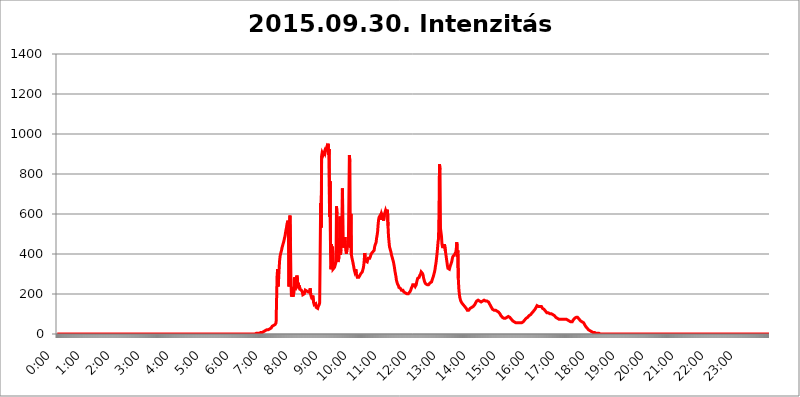
| Category | 2015.09.30. Intenzitás [W/m^2] |
|---|---|
| 0.0 | 0 |
| 0.0006944444444444445 | 0 |
| 0.001388888888888889 | 0 |
| 0.0020833333333333333 | 0 |
| 0.002777777777777778 | 0 |
| 0.003472222222222222 | 0 |
| 0.004166666666666667 | 0 |
| 0.004861111111111111 | 0 |
| 0.005555555555555556 | 0 |
| 0.0062499999999999995 | 0 |
| 0.006944444444444444 | 0 |
| 0.007638888888888889 | 0 |
| 0.008333333333333333 | 0 |
| 0.009027777777777779 | 0 |
| 0.009722222222222222 | 0 |
| 0.010416666666666666 | 0 |
| 0.011111111111111112 | 0 |
| 0.011805555555555555 | 0 |
| 0.012499999999999999 | 0 |
| 0.013194444444444444 | 0 |
| 0.013888888888888888 | 0 |
| 0.014583333333333332 | 0 |
| 0.015277777777777777 | 0 |
| 0.015972222222222224 | 0 |
| 0.016666666666666666 | 0 |
| 0.017361111111111112 | 0 |
| 0.018055555555555557 | 0 |
| 0.01875 | 0 |
| 0.019444444444444445 | 0 |
| 0.02013888888888889 | 0 |
| 0.020833333333333332 | 0 |
| 0.02152777777777778 | 0 |
| 0.022222222222222223 | 0 |
| 0.02291666666666667 | 0 |
| 0.02361111111111111 | 0 |
| 0.024305555555555556 | 0 |
| 0.024999999999999998 | 0 |
| 0.025694444444444447 | 0 |
| 0.02638888888888889 | 0 |
| 0.027083333333333334 | 0 |
| 0.027777777777777776 | 0 |
| 0.02847222222222222 | 0 |
| 0.029166666666666664 | 0 |
| 0.029861111111111113 | 0 |
| 0.030555555555555555 | 0 |
| 0.03125 | 0 |
| 0.03194444444444445 | 0 |
| 0.03263888888888889 | 0 |
| 0.03333333333333333 | 0 |
| 0.034027777777777775 | 0 |
| 0.034722222222222224 | 0 |
| 0.035416666666666666 | 0 |
| 0.036111111111111115 | 0 |
| 0.03680555555555556 | 0 |
| 0.0375 | 0 |
| 0.03819444444444444 | 0 |
| 0.03888888888888889 | 0 |
| 0.03958333333333333 | 0 |
| 0.04027777777777778 | 0 |
| 0.04097222222222222 | 0 |
| 0.041666666666666664 | 0 |
| 0.042361111111111106 | 0 |
| 0.04305555555555556 | 0 |
| 0.043750000000000004 | 0 |
| 0.044444444444444446 | 0 |
| 0.04513888888888889 | 0 |
| 0.04583333333333334 | 0 |
| 0.04652777777777778 | 0 |
| 0.04722222222222222 | 0 |
| 0.04791666666666666 | 0 |
| 0.04861111111111111 | 0 |
| 0.049305555555555554 | 0 |
| 0.049999999999999996 | 0 |
| 0.05069444444444445 | 0 |
| 0.051388888888888894 | 0 |
| 0.052083333333333336 | 0 |
| 0.05277777777777778 | 0 |
| 0.05347222222222222 | 0 |
| 0.05416666666666667 | 0 |
| 0.05486111111111111 | 0 |
| 0.05555555555555555 | 0 |
| 0.05625 | 0 |
| 0.05694444444444444 | 0 |
| 0.057638888888888885 | 0 |
| 0.05833333333333333 | 0 |
| 0.05902777777777778 | 0 |
| 0.059722222222222225 | 0 |
| 0.06041666666666667 | 0 |
| 0.061111111111111116 | 0 |
| 0.06180555555555556 | 0 |
| 0.0625 | 0 |
| 0.06319444444444444 | 0 |
| 0.06388888888888888 | 0 |
| 0.06458333333333334 | 0 |
| 0.06527777777777778 | 0 |
| 0.06597222222222222 | 0 |
| 0.06666666666666667 | 0 |
| 0.06736111111111111 | 0 |
| 0.06805555555555555 | 0 |
| 0.06874999999999999 | 0 |
| 0.06944444444444443 | 0 |
| 0.07013888888888889 | 0 |
| 0.07083333333333333 | 0 |
| 0.07152777777777779 | 0 |
| 0.07222222222222223 | 0 |
| 0.07291666666666667 | 0 |
| 0.07361111111111111 | 0 |
| 0.07430555555555556 | 0 |
| 0.075 | 0 |
| 0.07569444444444444 | 0 |
| 0.0763888888888889 | 0 |
| 0.07708333333333334 | 0 |
| 0.07777777777777778 | 0 |
| 0.07847222222222222 | 0 |
| 0.07916666666666666 | 0 |
| 0.0798611111111111 | 0 |
| 0.08055555555555556 | 0 |
| 0.08125 | 0 |
| 0.08194444444444444 | 0 |
| 0.08263888888888889 | 0 |
| 0.08333333333333333 | 0 |
| 0.08402777777777777 | 0 |
| 0.08472222222222221 | 0 |
| 0.08541666666666665 | 0 |
| 0.08611111111111112 | 0 |
| 0.08680555555555557 | 0 |
| 0.08750000000000001 | 0 |
| 0.08819444444444445 | 0 |
| 0.08888888888888889 | 0 |
| 0.08958333333333333 | 0 |
| 0.09027777777777778 | 0 |
| 0.09097222222222222 | 0 |
| 0.09166666666666667 | 0 |
| 0.09236111111111112 | 0 |
| 0.09305555555555556 | 0 |
| 0.09375 | 0 |
| 0.09444444444444444 | 0 |
| 0.09513888888888888 | 0 |
| 0.09583333333333333 | 0 |
| 0.09652777777777777 | 0 |
| 0.09722222222222222 | 0 |
| 0.09791666666666667 | 0 |
| 0.09861111111111111 | 0 |
| 0.09930555555555555 | 0 |
| 0.09999999999999999 | 0 |
| 0.10069444444444443 | 0 |
| 0.1013888888888889 | 0 |
| 0.10208333333333335 | 0 |
| 0.10277777777777779 | 0 |
| 0.10347222222222223 | 0 |
| 0.10416666666666667 | 0 |
| 0.10486111111111111 | 0 |
| 0.10555555555555556 | 0 |
| 0.10625 | 0 |
| 0.10694444444444444 | 0 |
| 0.1076388888888889 | 0 |
| 0.10833333333333334 | 0 |
| 0.10902777777777778 | 0 |
| 0.10972222222222222 | 0 |
| 0.1111111111111111 | 0 |
| 0.11180555555555556 | 0 |
| 0.11180555555555556 | 0 |
| 0.1125 | 0 |
| 0.11319444444444444 | 0 |
| 0.11388888888888889 | 0 |
| 0.11458333333333333 | 0 |
| 0.11527777777777777 | 0 |
| 0.11597222222222221 | 0 |
| 0.11666666666666665 | 0 |
| 0.1173611111111111 | 0 |
| 0.11805555555555557 | 0 |
| 0.11944444444444445 | 0 |
| 0.12013888888888889 | 0 |
| 0.12083333333333333 | 0 |
| 0.12152777777777778 | 0 |
| 0.12222222222222223 | 0 |
| 0.12291666666666667 | 0 |
| 0.12291666666666667 | 0 |
| 0.12361111111111112 | 0 |
| 0.12430555555555556 | 0 |
| 0.125 | 0 |
| 0.12569444444444444 | 0 |
| 0.12638888888888888 | 0 |
| 0.12708333333333333 | 0 |
| 0.16875 | 0 |
| 0.12847222222222224 | 0 |
| 0.12916666666666668 | 0 |
| 0.12986111111111112 | 0 |
| 0.13055555555555556 | 0 |
| 0.13125 | 0 |
| 0.13194444444444445 | 0 |
| 0.1326388888888889 | 0 |
| 0.13333333333333333 | 0 |
| 0.13402777777777777 | 0 |
| 0.13402777777777777 | 0 |
| 0.13472222222222222 | 0 |
| 0.13541666666666666 | 0 |
| 0.1361111111111111 | 0 |
| 0.13749999999999998 | 0 |
| 0.13819444444444443 | 0 |
| 0.1388888888888889 | 0 |
| 0.13958333333333334 | 0 |
| 0.14027777777777778 | 0 |
| 0.14097222222222222 | 0 |
| 0.14166666666666666 | 0 |
| 0.1423611111111111 | 0 |
| 0.14305555555555557 | 0 |
| 0.14375000000000002 | 0 |
| 0.14444444444444446 | 0 |
| 0.1451388888888889 | 0 |
| 0.1451388888888889 | 0 |
| 0.14652777777777778 | 0 |
| 0.14722222222222223 | 0 |
| 0.14791666666666667 | 0 |
| 0.1486111111111111 | 0 |
| 0.14930555555555555 | 0 |
| 0.15 | 0 |
| 0.15069444444444444 | 0 |
| 0.15138888888888888 | 0 |
| 0.15208333333333332 | 0 |
| 0.15277777777777776 | 0 |
| 0.15347222222222223 | 0 |
| 0.15416666666666667 | 0 |
| 0.15486111111111112 | 0 |
| 0.15555555555555556 | 0 |
| 0.15625 | 0 |
| 0.15694444444444444 | 0 |
| 0.15763888888888888 | 0 |
| 0.15833333333333333 | 0 |
| 0.15902777777777777 | 0 |
| 0.15972222222222224 | 0 |
| 0.16041666666666668 | 0 |
| 0.16111111111111112 | 0 |
| 0.16180555555555556 | 0 |
| 0.1625 | 0 |
| 0.16319444444444445 | 0 |
| 0.1638888888888889 | 0 |
| 0.16458333333333333 | 0 |
| 0.16527777777777777 | 0 |
| 0.16597222222222222 | 0 |
| 0.16666666666666666 | 0 |
| 0.1673611111111111 | 0 |
| 0.16805555555555554 | 0 |
| 0.16874999999999998 | 0 |
| 0.16944444444444443 | 0 |
| 0.17013888888888887 | 0 |
| 0.1708333333333333 | 0 |
| 0.17152777777777775 | 0 |
| 0.17222222222222225 | 0 |
| 0.1729166666666667 | 0 |
| 0.17361111111111113 | 0 |
| 0.17430555555555557 | 0 |
| 0.17500000000000002 | 0 |
| 0.17569444444444446 | 0 |
| 0.1763888888888889 | 0 |
| 0.17708333333333334 | 0 |
| 0.17777777777777778 | 0 |
| 0.17847222222222223 | 0 |
| 0.17916666666666667 | 0 |
| 0.1798611111111111 | 0 |
| 0.18055555555555555 | 0 |
| 0.18125 | 0 |
| 0.18194444444444444 | 0 |
| 0.1826388888888889 | 0 |
| 0.18333333333333335 | 0 |
| 0.1840277777777778 | 0 |
| 0.18472222222222223 | 0 |
| 0.18541666666666667 | 0 |
| 0.18611111111111112 | 0 |
| 0.18680555555555556 | 0 |
| 0.1875 | 0 |
| 0.18819444444444444 | 0 |
| 0.18888888888888888 | 0 |
| 0.18958333333333333 | 0 |
| 0.19027777777777777 | 0 |
| 0.1909722222222222 | 0 |
| 0.19166666666666665 | 0 |
| 0.19236111111111112 | 0 |
| 0.19305555555555554 | 0 |
| 0.19375 | 0 |
| 0.19444444444444445 | 0 |
| 0.1951388888888889 | 0 |
| 0.19583333333333333 | 0 |
| 0.19652777777777777 | 0 |
| 0.19722222222222222 | 0 |
| 0.19791666666666666 | 0 |
| 0.1986111111111111 | 0 |
| 0.19930555555555554 | 0 |
| 0.19999999999999998 | 0 |
| 0.20069444444444443 | 0 |
| 0.20138888888888887 | 0 |
| 0.2020833333333333 | 0 |
| 0.2027777777777778 | 0 |
| 0.2034722222222222 | 0 |
| 0.2041666666666667 | 0 |
| 0.20486111111111113 | 0 |
| 0.20555555555555557 | 0 |
| 0.20625000000000002 | 0 |
| 0.20694444444444446 | 0 |
| 0.2076388888888889 | 0 |
| 0.20833333333333334 | 0 |
| 0.20902777777777778 | 0 |
| 0.20972222222222223 | 0 |
| 0.21041666666666667 | 0 |
| 0.2111111111111111 | 0 |
| 0.21180555555555555 | 0 |
| 0.2125 | 0 |
| 0.21319444444444444 | 0 |
| 0.2138888888888889 | 0 |
| 0.21458333333333335 | 0 |
| 0.2152777777777778 | 0 |
| 0.21597222222222223 | 0 |
| 0.21666666666666667 | 0 |
| 0.21736111111111112 | 0 |
| 0.21805555555555556 | 0 |
| 0.21875 | 0 |
| 0.21944444444444444 | 0 |
| 0.22013888888888888 | 0 |
| 0.22083333333333333 | 0 |
| 0.22152777777777777 | 0 |
| 0.2222222222222222 | 0 |
| 0.22291666666666665 | 0 |
| 0.2236111111111111 | 0 |
| 0.22430555555555556 | 0 |
| 0.225 | 0 |
| 0.22569444444444445 | 0 |
| 0.2263888888888889 | 0 |
| 0.22708333333333333 | 0 |
| 0.22777777777777777 | 0 |
| 0.22847222222222222 | 0 |
| 0.22916666666666666 | 0 |
| 0.2298611111111111 | 0 |
| 0.23055555555555554 | 0 |
| 0.23124999999999998 | 0 |
| 0.23194444444444443 | 0 |
| 0.23263888888888887 | 0 |
| 0.2333333333333333 | 0 |
| 0.2340277777777778 | 0 |
| 0.2347222222222222 | 0 |
| 0.2354166666666667 | 0 |
| 0.23611111111111113 | 0 |
| 0.23680555555555557 | 0 |
| 0.23750000000000002 | 0 |
| 0.23819444444444446 | 0 |
| 0.2388888888888889 | 0 |
| 0.23958333333333334 | 0 |
| 0.24027777777777778 | 0 |
| 0.24097222222222223 | 0 |
| 0.24166666666666667 | 0 |
| 0.2423611111111111 | 0 |
| 0.24305555555555555 | 0 |
| 0.24375 | 0 |
| 0.24444444444444446 | 0 |
| 0.24513888888888888 | 0 |
| 0.24583333333333335 | 0 |
| 0.2465277777777778 | 0 |
| 0.24722222222222223 | 0 |
| 0.24791666666666667 | 0 |
| 0.24861111111111112 | 0 |
| 0.24930555555555556 | 0 |
| 0.25 | 0 |
| 0.25069444444444444 | 0 |
| 0.2513888888888889 | 0 |
| 0.2520833333333333 | 0 |
| 0.25277777777777777 | 0 |
| 0.2534722222222222 | 0 |
| 0.25416666666666665 | 0 |
| 0.2548611111111111 | 0 |
| 0.2555555555555556 | 0 |
| 0.25625000000000003 | 0 |
| 0.2569444444444445 | 0 |
| 0.2576388888888889 | 0 |
| 0.25833333333333336 | 0 |
| 0.2590277777777778 | 0 |
| 0.25972222222222224 | 0 |
| 0.2604166666666667 | 0 |
| 0.2611111111111111 | 0 |
| 0.26180555555555557 | 0 |
| 0.2625 | 0 |
| 0.26319444444444445 | 0 |
| 0.2638888888888889 | 0 |
| 0.26458333333333334 | 0 |
| 0.2652777777777778 | 0 |
| 0.2659722222222222 | 0 |
| 0.26666666666666666 | 0 |
| 0.2673611111111111 | 0 |
| 0.26805555555555555 | 0 |
| 0.26875 | 0 |
| 0.26944444444444443 | 0 |
| 0.2701388888888889 | 0 |
| 0.2708333333333333 | 0 |
| 0.27152777777777776 | 0 |
| 0.2722222222222222 | 0 |
| 0.27291666666666664 | 0 |
| 0.2736111111111111 | 0 |
| 0.2743055555555555 | 0 |
| 0.27499999999999997 | 0 |
| 0.27569444444444446 | 0 |
| 0.27638888888888885 | 0 |
| 0.27708333333333335 | 0 |
| 0.2777777777777778 | 0 |
| 0.27847222222222223 | 0 |
| 0.2791666666666667 | 3.525 |
| 0.2798611111111111 | 0 |
| 0.28055555555555556 | 3.525 |
| 0.28125 | 3.525 |
| 0.28194444444444444 | 3.525 |
| 0.2826388888888889 | 3.525 |
| 0.2833333333333333 | 3.525 |
| 0.28402777777777777 | 3.525 |
| 0.2847222222222222 | 3.525 |
| 0.28541666666666665 | 7.887 |
| 0.28611111111111115 | 7.887 |
| 0.28680555555555554 | 7.887 |
| 0.28750000000000003 | 7.887 |
| 0.2881944444444445 | 12.257 |
| 0.2888888888888889 | 12.257 |
| 0.28958333333333336 | 12.257 |
| 0.2902777777777778 | 12.257 |
| 0.29097222222222224 | 12.257 |
| 0.2916666666666667 | 16.636 |
| 0.2923611111111111 | 16.636 |
| 0.29305555555555557 | 16.636 |
| 0.29375 | 21.024 |
| 0.29444444444444445 | 21.024 |
| 0.2951388888888889 | 21.024 |
| 0.29583333333333334 | 21.024 |
| 0.2965277777777778 | 25.419 |
| 0.2972222222222222 | 25.419 |
| 0.29791666666666666 | 25.419 |
| 0.2986111111111111 | 29.823 |
| 0.29930555555555555 | 29.823 |
| 0.3 | 29.823 |
| 0.30069444444444443 | 34.234 |
| 0.3013888888888889 | 38.653 |
| 0.3020833333333333 | 38.653 |
| 0.30277777777777776 | 38.653 |
| 0.3034722222222222 | 43.079 |
| 0.30416666666666664 | 43.079 |
| 0.3048611111111111 | 47.511 |
| 0.3055555555555555 | 47.511 |
| 0.30624999999999997 | 51.951 |
| 0.3069444444444444 | 56.398 |
| 0.3076388888888889 | 56.398 |
| 0.30833333333333335 | 287.709 |
| 0.3090277777777778 | 324.052 |
| 0.30972222222222223 | 237.564 |
| 0.3104166666666667 | 269.49 |
| 0.3111111111111111 | 319.517 |
| 0.31180555555555556 | 364.728 |
| 0.3125 | 387.202 |
| 0.31319444444444444 | 400.638 |
| 0.3138888888888889 | 409.574 |
| 0.3145833333333333 | 418.492 |
| 0.31527777777777777 | 431.833 |
| 0.3159722222222222 | 440.702 |
| 0.31666666666666665 | 449.551 |
| 0.31736111111111115 | 458.38 |
| 0.31805555555555554 | 467.187 |
| 0.31875000000000003 | 480.356 |
| 0.3194444444444445 | 489.108 |
| 0.3201388888888889 | 506.542 |
| 0.32083333333333336 | 519.555 |
| 0.3215277777777778 | 532.513 |
| 0.32222222222222224 | 549.704 |
| 0.3229166666666667 | 558.261 |
| 0.3236111111111111 | 566.793 |
| 0.32430555555555557 | 475.972 |
| 0.325 | 237.564 |
| 0.32569444444444445 | 541.121 |
| 0.3263888888888889 | 592.233 |
| 0.32708333333333334 | 462.786 |
| 0.3277777777777778 | 264.932 |
| 0.3284722222222222 | 187.378 |
| 0.32916666666666666 | 205.62 |
| 0.3298611111111111 | 233 |
| 0.33055555555555555 | 187.378 |
| 0.33125 | 191.937 |
| 0.33194444444444443 | 210.182 |
| 0.3326388888888889 | 283.156 |
| 0.3333333333333333 | 219.309 |
| 0.3340277777777778 | 219.309 |
| 0.3347222222222222 | 242.127 |
| 0.3354166666666667 | 283.156 |
| 0.3361111111111111 | 292.259 |
| 0.3368055555555556 | 278.603 |
| 0.33749999999999997 | 237.564 |
| 0.33819444444444446 | 255.813 |
| 0.33888888888888885 | 228.436 |
| 0.33958333333333335 | 242.127 |
| 0.34027777777777773 | 223.873 |
| 0.34097222222222223 | 223.873 |
| 0.3416666666666666 | 228.436 |
| 0.3423611111111111 | 219.309 |
| 0.3430555555555555 | 214.746 |
| 0.34375 | 210.182 |
| 0.3444444444444445 | 196.497 |
| 0.3451388888888889 | 196.497 |
| 0.3458333333333334 | 196.497 |
| 0.34652777777777777 | 201.058 |
| 0.34722222222222227 | 210.182 |
| 0.34791666666666665 | 219.309 |
| 0.34861111111111115 | 214.746 |
| 0.34930555555555554 | 223.873 |
| 0.35000000000000003 | 214.746 |
| 0.3506944444444444 | 210.182 |
| 0.3513888888888889 | 210.182 |
| 0.3520833333333333 | 210.182 |
| 0.3527777777777778 | 210.182 |
| 0.3534722222222222 | 210.182 |
| 0.3541666666666667 | 214.746 |
| 0.3548611111111111 | 228.436 |
| 0.35555555555555557 | 196.497 |
| 0.35625 | 187.378 |
| 0.35694444444444445 | 182.82 |
| 0.3576388888888889 | 173.709 |
| 0.35833333333333334 | 191.937 |
| 0.3590277777777778 | 196.497 |
| 0.3597222222222222 | 155.509 |
| 0.36041666666666666 | 146.423 |
| 0.3611111111111111 | 146.423 |
| 0.36180555555555555 | 141.884 |
| 0.3625 | 150.964 |
| 0.36319444444444443 | 132.814 |
| 0.3638888888888889 | 128.284 |
| 0.3645833333333333 | 128.284 |
| 0.3652777777777778 | 128.284 |
| 0.3659722222222222 | 137.347 |
| 0.3666666666666667 | 141.884 |
| 0.3673611111111111 | 146.423 |
| 0.3680555555555556 | 155.509 |
| 0.36874999999999997 | 160.056 |
| 0.36944444444444446 | 654.791 |
| 0.37013888888888885 | 532.513 |
| 0.37083333333333335 | 891.099 |
| 0.37152777777777773 | 906.223 |
| 0.37222222222222223 | 902.447 |
| 0.3729166666666666 | 894.885 |
| 0.3736111111111111 | 898.668 |
| 0.3743055555555555 | 906.223 |
| 0.375 | 913.766 |
| 0.3756944444444445 | 906.223 |
| 0.3763888888888889 | 917.534 |
| 0.3770833333333334 | 921.298 |
| 0.37777777777777777 | 932.576 |
| 0.37847222222222227 | 936.33 |
| 0.37916666666666665 | 917.534 |
| 0.37986111111111115 | 951.327 |
| 0.38055555555555554 | 894.885 |
| 0.38125000000000003 | 925.06 |
| 0.3819444444444444 | 588.009 |
| 0.3826388888888889 | 763.674 |
| 0.3833333333333333 | 405.108 |
| 0.3840277777777778 | 324.052 |
| 0.3847222222222222 | 449.551 |
| 0.3854166666666667 | 378.224 |
| 0.3861111111111111 | 436.27 |
| 0.38680555555555557 | 324.052 |
| 0.3875 | 319.517 |
| 0.38819444444444445 | 328.584 |
| 0.3888888888888889 | 333.113 |
| 0.38958333333333334 | 342.162 |
| 0.3902777777777778 | 351.198 |
| 0.3909722222222222 | 360.221 |
| 0.39166666666666666 | 638.256 |
| 0.3923611111111111 | 600.661 |
| 0.39305555555555555 | 378.224 |
| 0.39375 | 360.221 |
| 0.39444444444444443 | 360.221 |
| 0.3951388888888889 | 382.715 |
| 0.3958333333333333 | 431.833 |
| 0.3965277777777778 | 588.009 |
| 0.3972222222222222 | 396.164 |
| 0.3979166666666667 | 418.492 |
| 0.3986111111111111 | 484.735 |
| 0.3993055555555556 | 445.129 |
| 0.39999999999999997 | 727.896 |
| 0.40069444444444446 | 458.38 |
| 0.40138888888888885 | 431.833 |
| 0.40208333333333335 | 462.786 |
| 0.40277777777777773 | 445.129 |
| 0.40347222222222223 | 484.735 |
| 0.4041666666666666 | 440.702 |
| 0.4048611111111111 | 414.035 |
| 0.4055555555555555 | 400.638 |
| 0.40625 | 405.108 |
| 0.4069444444444445 | 445.129 |
| 0.4076388888888889 | 436.27 |
| 0.4083333333333334 | 453.968 |
| 0.40902777777777777 | 453.968 |
| 0.40972222222222227 | 894.885 |
| 0.41041666666666665 | 860.676 |
| 0.41111111111111115 | 431.833 |
| 0.41180555555555554 | 600.661 |
| 0.41250000000000003 | 396.164 |
| 0.4131944444444444 | 382.715 |
| 0.4138888888888889 | 378.224 |
| 0.4145833333333333 | 360.221 |
| 0.4152777777777778 | 355.712 |
| 0.4159722222222222 | 333.113 |
| 0.4166666666666667 | 319.517 |
| 0.4173611111111111 | 310.44 |
| 0.41805555555555557 | 310.44 |
| 0.41875 | 324.052 |
| 0.41944444444444445 | 301.354 |
| 0.4201388888888889 | 292.259 |
| 0.42083333333333334 | 283.156 |
| 0.4215277777777778 | 278.603 |
| 0.4222222222222222 | 278.603 |
| 0.42291666666666666 | 283.156 |
| 0.4236111111111111 | 283.156 |
| 0.42430555555555555 | 292.259 |
| 0.425 | 296.808 |
| 0.42569444444444443 | 301.354 |
| 0.4263888888888889 | 305.898 |
| 0.4270833333333333 | 305.898 |
| 0.4277777777777778 | 310.44 |
| 0.4284722222222222 | 314.98 |
| 0.4291666666666667 | 328.584 |
| 0.4298611111111111 | 342.162 |
| 0.4305555555555556 | 369.23 |
| 0.43124999999999997 | 405.108 |
| 0.43194444444444446 | 373.729 |
| 0.43263888888888885 | 364.728 |
| 0.43333333333333335 | 369.23 |
| 0.43402777777777773 | 364.728 |
| 0.43472222222222223 | 360.221 |
| 0.4354166666666666 | 364.728 |
| 0.4361111111111111 | 378.224 |
| 0.4368055555555555 | 382.715 |
| 0.4375 | 373.729 |
| 0.4381944444444445 | 378.224 |
| 0.4388888888888889 | 378.224 |
| 0.4395833333333334 | 391.685 |
| 0.44027777777777777 | 400.638 |
| 0.44097222222222227 | 400.638 |
| 0.44166666666666665 | 405.108 |
| 0.44236111111111115 | 409.574 |
| 0.44305555555555554 | 414.035 |
| 0.44375000000000003 | 414.035 |
| 0.4444444444444444 | 418.492 |
| 0.4451388888888889 | 436.27 |
| 0.4458333333333333 | 445.129 |
| 0.4465277777777778 | 449.551 |
| 0.4472222222222222 | 458.38 |
| 0.4479166666666667 | 480.356 |
| 0.4486111111111111 | 493.475 |
| 0.44930555555555557 | 510.885 |
| 0.45 | 545.416 |
| 0.45069444444444445 | 571.049 |
| 0.4513888888888889 | 583.779 |
| 0.45208333333333334 | 583.779 |
| 0.4527777777777778 | 592.233 |
| 0.4534722222222222 | 571.049 |
| 0.45416666666666666 | 588.009 |
| 0.4548611111111111 | 600.661 |
| 0.45555555555555555 | 604.864 |
| 0.45625 | 596.45 |
| 0.45694444444444443 | 579.542 |
| 0.4576388888888889 | 566.793 |
| 0.4583333333333333 | 571.049 |
| 0.4590277777777778 | 600.661 |
| 0.4597222222222222 | 609.062 |
| 0.4604166666666667 | 617.436 |
| 0.4611111111111111 | 609.062 |
| 0.4618055555555556 | 600.661 |
| 0.46249999999999997 | 604.864 |
| 0.46319444444444446 | 621.613 |
| 0.46388888888888885 | 541.121 |
| 0.46458333333333335 | 489.108 |
| 0.46527777777777773 | 462.786 |
| 0.46597222222222223 | 436.27 |
| 0.4666666666666666 | 427.39 |
| 0.4673611111111111 | 422.943 |
| 0.4680555555555555 | 409.574 |
| 0.46875 | 396.164 |
| 0.4694444444444445 | 387.202 |
| 0.4701388888888889 | 378.224 |
| 0.4708333333333334 | 369.23 |
| 0.47152777777777777 | 360.221 |
| 0.47222222222222227 | 346.682 |
| 0.47291666666666665 | 333.113 |
| 0.47361111111111115 | 314.98 |
| 0.47430555555555554 | 301.354 |
| 0.47500000000000003 | 287.709 |
| 0.4756944444444444 | 269.49 |
| 0.4763888888888889 | 260.373 |
| 0.4770833333333333 | 251.251 |
| 0.4777777777777778 | 246.689 |
| 0.4784722222222222 | 242.127 |
| 0.4791666666666667 | 233 |
| 0.4798611111111111 | 228.436 |
| 0.48055555555555557 | 228.436 |
| 0.48125 | 228.436 |
| 0.48194444444444445 | 223.873 |
| 0.4826388888888889 | 219.309 |
| 0.48333333333333334 | 219.309 |
| 0.4840277777777778 | 219.309 |
| 0.4847222222222222 | 219.309 |
| 0.48541666666666666 | 214.746 |
| 0.4861111111111111 | 210.182 |
| 0.48680555555555555 | 205.62 |
| 0.4875 | 205.62 |
| 0.48819444444444443 | 205.62 |
| 0.4888888888888889 | 205.62 |
| 0.4895833333333333 | 205.62 |
| 0.4902777777777778 | 201.058 |
| 0.4909722222222222 | 201.058 |
| 0.4916666666666667 | 201.058 |
| 0.4923611111111111 | 201.058 |
| 0.4930555555555556 | 201.058 |
| 0.49374999999999997 | 205.62 |
| 0.49444444444444446 | 210.182 |
| 0.49513888888888885 | 214.746 |
| 0.49583333333333335 | 219.309 |
| 0.49652777777777773 | 228.436 |
| 0.49722222222222223 | 233 |
| 0.4979166666666666 | 237.564 |
| 0.4986111111111111 | 246.689 |
| 0.4993055555555555 | 251.251 |
| 0.5 | 251.251 |
| 0.5006944444444444 | 246.689 |
| 0.5013888888888889 | 242.127 |
| 0.5020833333333333 | 237.564 |
| 0.5027777777777778 | 242.127 |
| 0.5034722222222222 | 246.689 |
| 0.5041666666666667 | 260.373 |
| 0.5048611111111111 | 269.49 |
| 0.5055555555555555 | 278.603 |
| 0.50625 | 283.156 |
| 0.5069444444444444 | 278.603 |
| 0.5076388888888889 | 283.156 |
| 0.5083333333333333 | 292.259 |
| 0.5090277777777777 | 292.259 |
| 0.5097222222222222 | 301.354 |
| 0.5104166666666666 | 310.44 |
| 0.5111111111111112 | 314.98 |
| 0.5118055555555555 | 314.98 |
| 0.5125000000000001 | 301.354 |
| 0.5131944444444444 | 292.259 |
| 0.513888888888889 | 278.603 |
| 0.5145833333333333 | 269.49 |
| 0.5152777777777778 | 260.373 |
| 0.5159722222222222 | 255.813 |
| 0.5166666666666667 | 251.251 |
| 0.517361111111111 | 251.251 |
| 0.5180555555555556 | 246.689 |
| 0.5187499999999999 | 246.689 |
| 0.5194444444444445 | 246.689 |
| 0.5201388888888888 | 246.689 |
| 0.5208333333333334 | 246.689 |
| 0.5215277777777778 | 251.251 |
| 0.5222222222222223 | 251.251 |
| 0.5229166666666667 | 255.813 |
| 0.5236111111111111 | 255.813 |
| 0.5243055555555556 | 260.373 |
| 0.525 | 260.373 |
| 0.5256944444444445 | 269.49 |
| 0.5263888888888889 | 274.047 |
| 0.5270833333333333 | 283.156 |
| 0.5277777777777778 | 292.259 |
| 0.5284722222222222 | 301.354 |
| 0.5291666666666667 | 310.44 |
| 0.5298611111111111 | 324.052 |
| 0.5305555555555556 | 342.162 |
| 0.53125 | 355.712 |
| 0.5319444444444444 | 378.224 |
| 0.5326388888888889 | 400.638 |
| 0.5333333333333333 | 427.39 |
| 0.5340277777777778 | 458.38 |
| 0.5347222222222222 | 475.972 |
| 0.5354166666666667 | 600.661 |
| 0.5361111111111111 | 849.199 |
| 0.5368055555555555 | 822.26 |
| 0.5375 | 528.2 |
| 0.5381944444444444 | 532.513 |
| 0.5388888888888889 | 489.108 |
| 0.5395833333333333 | 449.551 |
| 0.5402777777777777 | 436.27 |
| 0.5409722222222222 | 431.833 |
| 0.5416666666666666 | 431.833 |
| 0.5423611111111112 | 436.27 |
| 0.5430555555555555 | 449.551 |
| 0.5437500000000001 | 445.129 |
| 0.5444444444444444 | 414.035 |
| 0.545138888888889 | 396.164 |
| 0.5458333333333333 | 378.224 |
| 0.5465277777777778 | 360.221 |
| 0.5472222222222222 | 342.162 |
| 0.5479166666666667 | 328.584 |
| 0.548611111111111 | 324.052 |
| 0.5493055555555556 | 324.052 |
| 0.5499999999999999 | 324.052 |
| 0.5506944444444445 | 333.113 |
| 0.5513888888888888 | 342.162 |
| 0.5520833333333334 | 346.682 |
| 0.5527777777777778 | 355.712 |
| 0.5534722222222223 | 364.728 |
| 0.5541666666666667 | 378.224 |
| 0.5548611111111111 | 387.202 |
| 0.5555555555555556 | 387.202 |
| 0.55625 | 391.685 |
| 0.5569444444444445 | 396.164 |
| 0.5576388888888889 | 400.638 |
| 0.5583333333333333 | 400.638 |
| 0.5590277777777778 | 409.574 |
| 0.5597222222222222 | 427.39 |
| 0.5604166666666667 | 458.38 |
| 0.5611111111111111 | 387.202 |
| 0.5618055555555556 | 418.492 |
| 0.5625 | 278.603 |
| 0.5631944444444444 | 228.436 |
| 0.5638888888888889 | 201.058 |
| 0.5645833333333333 | 182.82 |
| 0.5652777777777778 | 173.709 |
| 0.5659722222222222 | 164.605 |
| 0.5666666666666667 | 160.056 |
| 0.5673611111111111 | 155.509 |
| 0.5680555555555555 | 150.964 |
| 0.56875 | 150.964 |
| 0.5694444444444444 | 146.423 |
| 0.5701388888888889 | 146.423 |
| 0.5708333333333333 | 141.884 |
| 0.5715277777777777 | 137.347 |
| 0.5722222222222222 | 137.347 |
| 0.5729166666666666 | 132.814 |
| 0.5736111111111112 | 128.284 |
| 0.5743055555555555 | 123.758 |
| 0.5750000000000001 | 119.235 |
| 0.5756944444444444 | 119.235 |
| 0.576388888888889 | 119.235 |
| 0.5770833333333333 | 119.235 |
| 0.5777777777777778 | 119.235 |
| 0.5784722222222222 | 123.758 |
| 0.5791666666666667 | 128.284 |
| 0.579861111111111 | 128.284 |
| 0.5805555555555556 | 128.284 |
| 0.5812499999999999 | 132.814 |
| 0.5819444444444445 | 137.347 |
| 0.5826388888888888 | 137.347 |
| 0.5833333333333334 | 137.347 |
| 0.5840277777777778 | 137.347 |
| 0.5847222222222223 | 141.884 |
| 0.5854166666666667 | 146.423 |
| 0.5861111111111111 | 146.423 |
| 0.5868055555555556 | 155.509 |
| 0.5875 | 155.509 |
| 0.5881944444444445 | 164.605 |
| 0.5888888888888889 | 169.156 |
| 0.5895833333333333 | 169.156 |
| 0.5902777777777778 | 169.156 |
| 0.5909722222222222 | 169.156 |
| 0.5916666666666667 | 169.156 |
| 0.5923611111111111 | 164.605 |
| 0.5930555555555556 | 164.605 |
| 0.59375 | 160.056 |
| 0.5944444444444444 | 160.056 |
| 0.5951388888888889 | 160.056 |
| 0.5958333333333333 | 164.605 |
| 0.5965277777777778 | 164.605 |
| 0.5972222222222222 | 169.156 |
| 0.5979166666666667 | 169.156 |
| 0.5986111111111111 | 169.156 |
| 0.5993055555555555 | 169.156 |
| 0.6 | 164.605 |
| 0.6006944444444444 | 164.605 |
| 0.6013888888888889 | 164.605 |
| 0.6020833333333333 | 164.605 |
| 0.6027777777777777 | 164.605 |
| 0.6034722222222222 | 164.605 |
| 0.6041666666666666 | 164.605 |
| 0.6048611111111112 | 160.056 |
| 0.6055555555555555 | 155.509 |
| 0.6062500000000001 | 150.964 |
| 0.6069444444444444 | 146.423 |
| 0.607638888888889 | 141.884 |
| 0.6083333333333333 | 137.347 |
| 0.6090277777777778 | 132.814 |
| 0.6097222222222222 | 128.284 |
| 0.6104166666666667 | 123.758 |
| 0.611111111111111 | 119.235 |
| 0.6118055555555556 | 119.235 |
| 0.6124999999999999 | 119.235 |
| 0.6131944444444445 | 119.235 |
| 0.6138888888888888 | 119.235 |
| 0.6145833333333334 | 119.235 |
| 0.6152777777777778 | 119.235 |
| 0.6159722222222223 | 119.235 |
| 0.6166666666666667 | 114.716 |
| 0.6173611111111111 | 114.716 |
| 0.6180555555555556 | 110.201 |
| 0.61875 | 110.201 |
| 0.6194444444444445 | 110.201 |
| 0.6201388888888889 | 105.69 |
| 0.6208333333333333 | 101.184 |
| 0.6215277777777778 | 96.682 |
| 0.6222222222222222 | 92.184 |
| 0.6229166666666667 | 92.184 |
| 0.6236111111111111 | 87.692 |
| 0.6243055555555556 | 83.205 |
| 0.625 | 78.722 |
| 0.6256944444444444 | 78.722 |
| 0.6263888888888889 | 78.722 |
| 0.6270833333333333 | 78.722 |
| 0.6277777777777778 | 78.722 |
| 0.6284722222222222 | 78.722 |
| 0.6291666666666667 | 78.722 |
| 0.6298611111111111 | 83.205 |
| 0.6305555555555555 | 83.205 |
| 0.63125 | 83.205 |
| 0.6319444444444444 | 83.205 |
| 0.6326388888888889 | 87.692 |
| 0.6333333333333333 | 87.692 |
| 0.6340277777777777 | 87.692 |
| 0.6347222222222222 | 83.205 |
| 0.6354166666666666 | 83.205 |
| 0.6361111111111112 | 78.722 |
| 0.6368055555555555 | 74.246 |
| 0.6375000000000001 | 69.775 |
| 0.6381944444444444 | 69.775 |
| 0.638888888888889 | 65.31 |
| 0.6395833333333333 | 65.31 |
| 0.6402777777777778 | 60.85 |
| 0.6409722222222222 | 60.85 |
| 0.6416666666666667 | 60.85 |
| 0.642361111111111 | 56.398 |
| 0.6430555555555556 | 56.398 |
| 0.6437499999999999 | 56.398 |
| 0.6444444444444445 | 56.398 |
| 0.6451388888888888 | 56.398 |
| 0.6458333333333334 | 56.398 |
| 0.6465277777777778 | 56.398 |
| 0.6472222222222223 | 56.398 |
| 0.6479166666666667 | 56.398 |
| 0.6486111111111111 | 56.398 |
| 0.6493055555555556 | 56.398 |
| 0.65 | 51.951 |
| 0.6506944444444445 | 56.398 |
| 0.6513888888888889 | 56.398 |
| 0.6520833333333333 | 56.398 |
| 0.6527777777777778 | 60.85 |
| 0.6534722222222222 | 60.85 |
| 0.6541666666666667 | 65.31 |
| 0.6548611111111111 | 65.31 |
| 0.6555555555555556 | 69.775 |
| 0.65625 | 74.246 |
| 0.6569444444444444 | 74.246 |
| 0.6576388888888889 | 78.722 |
| 0.6583333333333333 | 78.722 |
| 0.6590277777777778 | 83.205 |
| 0.6597222222222222 | 83.205 |
| 0.6604166666666667 | 87.692 |
| 0.6611111111111111 | 87.692 |
| 0.6618055555555555 | 92.184 |
| 0.6625 | 92.184 |
| 0.6631944444444444 | 92.184 |
| 0.6638888888888889 | 96.682 |
| 0.6645833333333333 | 96.682 |
| 0.6652777777777777 | 101.184 |
| 0.6659722222222222 | 105.69 |
| 0.6666666666666666 | 110.201 |
| 0.6673611111111111 | 110.201 |
| 0.6680555555555556 | 114.716 |
| 0.6687500000000001 | 119.235 |
| 0.6694444444444444 | 119.235 |
| 0.6701388888888888 | 123.758 |
| 0.6708333333333334 | 128.284 |
| 0.6715277777777778 | 132.814 |
| 0.6722222222222222 | 137.347 |
| 0.6729166666666666 | 141.884 |
| 0.6736111111111112 | 141.884 |
| 0.6743055555555556 | 137.347 |
| 0.6749999999999999 | 137.347 |
| 0.6756944444444444 | 137.347 |
| 0.6763888888888889 | 137.347 |
| 0.6770833333333334 | 137.347 |
| 0.6777777777777777 | 137.347 |
| 0.6784722222222223 | 137.347 |
| 0.6791666666666667 | 137.347 |
| 0.6798611111111111 | 132.814 |
| 0.6805555555555555 | 128.284 |
| 0.68125 | 128.284 |
| 0.6819444444444445 | 123.758 |
| 0.6826388888888889 | 123.758 |
| 0.6833333333333332 | 119.235 |
| 0.6840277777777778 | 119.235 |
| 0.6847222222222222 | 114.716 |
| 0.6854166666666667 | 110.201 |
| 0.686111111111111 | 110.201 |
| 0.6868055555555556 | 105.69 |
| 0.6875 | 105.69 |
| 0.6881944444444444 | 105.69 |
| 0.688888888888889 | 105.69 |
| 0.6895833333333333 | 101.184 |
| 0.6902777777777778 | 101.184 |
| 0.6909722222222222 | 101.184 |
| 0.6916666666666668 | 101.184 |
| 0.6923611111111111 | 101.184 |
| 0.6930555555555555 | 101.184 |
| 0.69375 | 96.682 |
| 0.6944444444444445 | 96.682 |
| 0.6951388888888889 | 96.682 |
| 0.6958333333333333 | 92.184 |
| 0.6965277777777777 | 92.184 |
| 0.6972222222222223 | 92.184 |
| 0.6979166666666666 | 87.692 |
| 0.6986111111111111 | 87.692 |
| 0.6993055555555556 | 83.205 |
| 0.7000000000000001 | 83.205 |
| 0.7006944444444444 | 78.722 |
| 0.7013888888888888 | 78.722 |
| 0.7020833333333334 | 74.246 |
| 0.7027777777777778 | 74.246 |
| 0.7034722222222222 | 74.246 |
| 0.7041666666666666 | 74.246 |
| 0.7048611111111112 | 74.246 |
| 0.7055555555555556 | 74.246 |
| 0.7062499999999999 | 74.246 |
| 0.7069444444444444 | 74.246 |
| 0.7076388888888889 | 74.246 |
| 0.7083333333333334 | 74.246 |
| 0.7090277777777777 | 74.246 |
| 0.7097222222222223 | 74.246 |
| 0.7104166666666667 | 74.246 |
| 0.7111111111111111 | 74.246 |
| 0.7118055555555555 | 74.246 |
| 0.7125 | 74.246 |
| 0.7131944444444445 | 74.246 |
| 0.7138888888888889 | 74.246 |
| 0.7145833333333332 | 74.246 |
| 0.7152777777777778 | 69.775 |
| 0.7159722222222222 | 69.775 |
| 0.7166666666666667 | 65.31 |
| 0.717361111111111 | 65.31 |
| 0.7180555555555556 | 65.31 |
| 0.71875 | 60.85 |
| 0.7194444444444444 | 60.85 |
| 0.720138888888889 | 60.85 |
| 0.7208333333333333 | 60.85 |
| 0.7215277777777778 | 60.85 |
| 0.7222222222222222 | 60.85 |
| 0.7229166666666668 | 65.31 |
| 0.7236111111111111 | 69.775 |
| 0.7243055555555555 | 74.246 |
| 0.725 | 74.246 |
| 0.7256944444444445 | 78.722 |
| 0.7263888888888889 | 83.205 |
| 0.7270833333333333 | 83.205 |
| 0.7277777777777777 | 83.205 |
| 0.7284722222222223 | 83.205 |
| 0.7291666666666666 | 83.205 |
| 0.7298611111111111 | 83.205 |
| 0.7305555555555556 | 78.722 |
| 0.7312500000000001 | 78.722 |
| 0.7319444444444444 | 74.246 |
| 0.7326388888888888 | 74.246 |
| 0.7333333333333334 | 69.775 |
| 0.7340277777777778 | 65.31 |
| 0.7347222222222222 | 65.31 |
| 0.7354166666666666 | 60.85 |
| 0.7361111111111112 | 60.85 |
| 0.7368055555555556 | 60.85 |
| 0.7374999999999999 | 56.398 |
| 0.7381944444444444 | 56.398 |
| 0.7388888888888889 | 51.951 |
| 0.7395833333333334 | 47.511 |
| 0.7402777777777777 | 47.511 |
| 0.7409722222222223 | 38.653 |
| 0.7416666666666667 | 38.653 |
| 0.7423611111111111 | 34.234 |
| 0.7430555555555555 | 29.823 |
| 0.74375 | 25.419 |
| 0.7444444444444445 | 25.419 |
| 0.7451388888888889 | 21.024 |
| 0.7458333333333332 | 21.024 |
| 0.7465277777777778 | 16.636 |
| 0.7472222222222222 | 16.636 |
| 0.7479166666666667 | 16.636 |
| 0.748611111111111 | 12.257 |
| 0.7493055555555556 | 12.257 |
| 0.75 | 12.257 |
| 0.7506944444444444 | 12.257 |
| 0.751388888888889 | 7.887 |
| 0.7520833333333333 | 7.887 |
| 0.7527777777777778 | 7.887 |
| 0.7534722222222222 | 7.887 |
| 0.7541666666666668 | 7.887 |
| 0.7548611111111111 | 3.525 |
| 0.7555555555555555 | 3.525 |
| 0.75625 | 3.525 |
| 0.7569444444444445 | 3.525 |
| 0.7576388888888889 | 3.525 |
| 0.7583333333333333 | 3.525 |
| 0.7590277777777777 | 3.525 |
| 0.7597222222222223 | 3.525 |
| 0.7604166666666666 | 0 |
| 0.7611111111111111 | 0 |
| 0.7618055555555556 | 0 |
| 0.7625000000000001 | 0 |
| 0.7631944444444444 | 0 |
| 0.7638888888888888 | 0 |
| 0.7645833333333334 | 0 |
| 0.7652777777777778 | 0 |
| 0.7659722222222222 | 0 |
| 0.7666666666666666 | 0 |
| 0.7673611111111112 | 0 |
| 0.7680555555555556 | 0 |
| 0.7687499999999999 | 0 |
| 0.7694444444444444 | 0 |
| 0.7701388888888889 | 0 |
| 0.7708333333333334 | 0 |
| 0.7715277777777777 | 0 |
| 0.7722222222222223 | 0 |
| 0.7729166666666667 | 0 |
| 0.7736111111111111 | 0 |
| 0.7743055555555555 | 0 |
| 0.775 | 0 |
| 0.7756944444444445 | 0 |
| 0.7763888888888889 | 0 |
| 0.7770833333333332 | 0 |
| 0.7777777777777778 | 0 |
| 0.7784722222222222 | 0 |
| 0.7791666666666667 | 0 |
| 0.779861111111111 | 0 |
| 0.7805555555555556 | 0 |
| 0.78125 | 0 |
| 0.7819444444444444 | 0 |
| 0.782638888888889 | 0 |
| 0.7833333333333333 | 0 |
| 0.7840277777777778 | 0 |
| 0.7847222222222222 | 0 |
| 0.7854166666666668 | 0 |
| 0.7861111111111111 | 0 |
| 0.7868055555555555 | 0 |
| 0.7875 | 0 |
| 0.7881944444444445 | 0 |
| 0.7888888888888889 | 0 |
| 0.7895833333333333 | 0 |
| 0.7902777777777777 | 0 |
| 0.7909722222222223 | 0 |
| 0.7916666666666666 | 0 |
| 0.7923611111111111 | 0 |
| 0.7930555555555556 | 0 |
| 0.7937500000000001 | 0 |
| 0.7944444444444444 | 0 |
| 0.7951388888888888 | 0 |
| 0.7958333333333334 | 0 |
| 0.7965277777777778 | 0 |
| 0.7972222222222222 | 0 |
| 0.7979166666666666 | 0 |
| 0.7986111111111112 | 0 |
| 0.7993055555555556 | 0 |
| 0.7999999999999999 | 0 |
| 0.8006944444444444 | 0 |
| 0.8013888888888889 | 0 |
| 0.8020833333333334 | 0 |
| 0.8027777777777777 | 0 |
| 0.8034722222222223 | 0 |
| 0.8041666666666667 | 0 |
| 0.8048611111111111 | 0 |
| 0.8055555555555555 | 0 |
| 0.80625 | 0 |
| 0.8069444444444445 | 0 |
| 0.8076388888888889 | 0 |
| 0.8083333333333332 | 0 |
| 0.8090277777777778 | 0 |
| 0.8097222222222222 | 0 |
| 0.8104166666666667 | 0 |
| 0.811111111111111 | 0 |
| 0.8118055555555556 | 0 |
| 0.8125 | 0 |
| 0.8131944444444444 | 0 |
| 0.813888888888889 | 0 |
| 0.8145833333333333 | 0 |
| 0.8152777777777778 | 0 |
| 0.8159722222222222 | 0 |
| 0.8166666666666668 | 0 |
| 0.8173611111111111 | 0 |
| 0.8180555555555555 | 0 |
| 0.81875 | 0 |
| 0.8194444444444445 | 0 |
| 0.8201388888888889 | 0 |
| 0.8208333333333333 | 0 |
| 0.8215277777777777 | 0 |
| 0.8222222222222223 | 0 |
| 0.8229166666666666 | 0 |
| 0.8236111111111111 | 0 |
| 0.8243055555555556 | 0 |
| 0.8250000000000001 | 0 |
| 0.8256944444444444 | 0 |
| 0.8263888888888888 | 0 |
| 0.8270833333333334 | 0 |
| 0.8277777777777778 | 0 |
| 0.8284722222222222 | 0 |
| 0.8291666666666666 | 0 |
| 0.8298611111111112 | 0 |
| 0.8305555555555556 | 0 |
| 0.8312499999999999 | 0 |
| 0.8319444444444444 | 0 |
| 0.8326388888888889 | 0 |
| 0.8333333333333334 | 0 |
| 0.8340277777777777 | 0 |
| 0.8347222222222223 | 0 |
| 0.8354166666666667 | 0 |
| 0.8361111111111111 | 0 |
| 0.8368055555555555 | 0 |
| 0.8375 | 0 |
| 0.8381944444444445 | 0 |
| 0.8388888888888889 | 0 |
| 0.8395833333333332 | 0 |
| 0.8402777777777778 | 0 |
| 0.8409722222222222 | 0 |
| 0.8416666666666667 | 0 |
| 0.842361111111111 | 0 |
| 0.8430555555555556 | 0 |
| 0.84375 | 0 |
| 0.8444444444444444 | 0 |
| 0.845138888888889 | 0 |
| 0.8458333333333333 | 0 |
| 0.8465277777777778 | 0 |
| 0.8472222222222222 | 0 |
| 0.8479166666666668 | 0 |
| 0.8486111111111111 | 0 |
| 0.8493055555555555 | 0 |
| 0.85 | 0 |
| 0.8506944444444445 | 0 |
| 0.8513888888888889 | 0 |
| 0.8520833333333333 | 0 |
| 0.8527777777777777 | 0 |
| 0.8534722222222223 | 0 |
| 0.8541666666666666 | 0 |
| 0.8548611111111111 | 0 |
| 0.8555555555555556 | 0 |
| 0.8562500000000001 | 0 |
| 0.8569444444444444 | 0 |
| 0.8576388888888888 | 0 |
| 0.8583333333333334 | 0 |
| 0.8590277777777778 | 0 |
| 0.8597222222222222 | 0 |
| 0.8604166666666666 | 0 |
| 0.8611111111111112 | 0 |
| 0.8618055555555556 | 0 |
| 0.8624999999999999 | 0 |
| 0.8631944444444444 | 0 |
| 0.8638888888888889 | 0 |
| 0.8645833333333334 | 0 |
| 0.8652777777777777 | 0 |
| 0.8659722222222223 | 0 |
| 0.8666666666666667 | 0 |
| 0.8673611111111111 | 0 |
| 0.8680555555555555 | 0 |
| 0.86875 | 0 |
| 0.8694444444444445 | 0 |
| 0.8701388888888889 | 0 |
| 0.8708333333333332 | 0 |
| 0.8715277777777778 | 0 |
| 0.8722222222222222 | 0 |
| 0.8729166666666667 | 0 |
| 0.873611111111111 | 0 |
| 0.8743055555555556 | 0 |
| 0.875 | 0 |
| 0.8756944444444444 | 0 |
| 0.876388888888889 | 0 |
| 0.8770833333333333 | 0 |
| 0.8777777777777778 | 0 |
| 0.8784722222222222 | 0 |
| 0.8791666666666668 | 0 |
| 0.8798611111111111 | 0 |
| 0.8805555555555555 | 0 |
| 0.88125 | 0 |
| 0.8819444444444445 | 0 |
| 0.8826388888888889 | 0 |
| 0.8833333333333333 | 0 |
| 0.8840277777777777 | 0 |
| 0.8847222222222223 | 0 |
| 0.8854166666666666 | 0 |
| 0.8861111111111111 | 0 |
| 0.8868055555555556 | 0 |
| 0.8875000000000001 | 0 |
| 0.8881944444444444 | 0 |
| 0.8888888888888888 | 0 |
| 0.8895833333333334 | 0 |
| 0.8902777777777778 | 0 |
| 0.8909722222222222 | 0 |
| 0.8916666666666666 | 0 |
| 0.8923611111111112 | 0 |
| 0.8930555555555556 | 0 |
| 0.8937499999999999 | 0 |
| 0.8944444444444444 | 0 |
| 0.8951388888888889 | 0 |
| 0.8958333333333334 | 0 |
| 0.8965277777777777 | 0 |
| 0.8972222222222223 | 0 |
| 0.8979166666666667 | 0 |
| 0.8986111111111111 | 0 |
| 0.8993055555555555 | 0 |
| 0.9 | 0 |
| 0.9006944444444445 | 0 |
| 0.9013888888888889 | 0 |
| 0.9020833333333332 | 0 |
| 0.9027777777777778 | 0 |
| 0.9034722222222222 | 0 |
| 0.9041666666666667 | 0 |
| 0.904861111111111 | 0 |
| 0.9055555555555556 | 0 |
| 0.90625 | 0 |
| 0.9069444444444444 | 0 |
| 0.907638888888889 | 0 |
| 0.9083333333333333 | 0 |
| 0.9090277777777778 | 0 |
| 0.9097222222222222 | 0 |
| 0.9104166666666668 | 0 |
| 0.9111111111111111 | 0 |
| 0.9118055555555555 | 0 |
| 0.9125 | 0 |
| 0.9131944444444445 | 0 |
| 0.9138888888888889 | 0 |
| 0.9145833333333333 | 0 |
| 0.9152777777777777 | 0 |
| 0.9159722222222223 | 0 |
| 0.9166666666666666 | 0 |
| 0.9173611111111111 | 0 |
| 0.9180555555555556 | 0 |
| 0.9187500000000001 | 0 |
| 0.9194444444444444 | 0 |
| 0.9201388888888888 | 0 |
| 0.9208333333333334 | 0 |
| 0.9215277777777778 | 0 |
| 0.9222222222222222 | 0 |
| 0.9229166666666666 | 0 |
| 0.9236111111111112 | 0 |
| 0.9243055555555556 | 0 |
| 0.9249999999999999 | 0 |
| 0.9256944444444444 | 0 |
| 0.9263888888888889 | 0 |
| 0.9270833333333334 | 0 |
| 0.9277777777777777 | 0 |
| 0.9284722222222223 | 0 |
| 0.9291666666666667 | 0 |
| 0.9298611111111111 | 0 |
| 0.9305555555555555 | 0 |
| 0.93125 | 0 |
| 0.9319444444444445 | 0 |
| 0.9326388888888889 | 0 |
| 0.9333333333333332 | 0 |
| 0.9340277777777778 | 0 |
| 0.9347222222222222 | 0 |
| 0.9354166666666667 | 0 |
| 0.936111111111111 | 0 |
| 0.9368055555555556 | 0 |
| 0.9375 | 0 |
| 0.9381944444444444 | 0 |
| 0.938888888888889 | 0 |
| 0.9395833333333333 | 0 |
| 0.9402777777777778 | 0 |
| 0.9409722222222222 | 0 |
| 0.9416666666666668 | 0 |
| 0.9423611111111111 | 0 |
| 0.9430555555555555 | 0 |
| 0.94375 | 0 |
| 0.9444444444444445 | 0 |
| 0.9451388888888889 | 0 |
| 0.9458333333333333 | 0 |
| 0.9465277777777777 | 0 |
| 0.9472222222222223 | 0 |
| 0.9479166666666666 | 0 |
| 0.9486111111111111 | 0 |
| 0.9493055555555556 | 0 |
| 0.9500000000000001 | 0 |
| 0.9506944444444444 | 0 |
| 0.9513888888888888 | 0 |
| 0.9520833333333334 | 0 |
| 0.9527777777777778 | 0 |
| 0.9534722222222222 | 0 |
| 0.9541666666666666 | 0 |
| 0.9548611111111112 | 0 |
| 0.9555555555555556 | 0 |
| 0.9562499999999999 | 0 |
| 0.9569444444444444 | 0 |
| 0.9576388888888889 | 0 |
| 0.9583333333333334 | 0 |
| 0.9590277777777777 | 0 |
| 0.9597222222222223 | 0 |
| 0.9604166666666667 | 0 |
| 0.9611111111111111 | 0 |
| 0.9618055555555555 | 0 |
| 0.9625 | 0 |
| 0.9631944444444445 | 0 |
| 0.9638888888888889 | 0 |
| 0.9645833333333332 | 0 |
| 0.9652777777777778 | 0 |
| 0.9659722222222222 | 0 |
| 0.9666666666666667 | 0 |
| 0.967361111111111 | 0 |
| 0.9680555555555556 | 0 |
| 0.96875 | 0 |
| 0.9694444444444444 | 0 |
| 0.970138888888889 | 0 |
| 0.9708333333333333 | 0 |
| 0.9715277777777778 | 0 |
| 0.9722222222222222 | 0 |
| 0.9729166666666668 | 0 |
| 0.9736111111111111 | 0 |
| 0.9743055555555555 | 0 |
| 0.975 | 0 |
| 0.9756944444444445 | 0 |
| 0.9763888888888889 | 0 |
| 0.9770833333333333 | 0 |
| 0.9777777777777777 | 0 |
| 0.9784722222222223 | 0 |
| 0.9791666666666666 | 0 |
| 0.9798611111111111 | 0 |
| 0.9805555555555556 | 0 |
| 0.9812500000000001 | 0 |
| 0.9819444444444444 | 0 |
| 0.9826388888888888 | 0 |
| 0.9833333333333334 | 0 |
| 0.9840277777777778 | 0 |
| 0.9847222222222222 | 0 |
| 0.9854166666666666 | 0 |
| 0.9861111111111112 | 0 |
| 0.9868055555555556 | 0 |
| 0.9874999999999999 | 0 |
| 0.9881944444444444 | 0 |
| 0.9888888888888889 | 0 |
| 0.9895833333333334 | 0 |
| 0.9902777777777777 | 0 |
| 0.9909722222222223 | 0 |
| 0.9916666666666667 | 0 |
| 0.9923611111111111 | 0 |
| 0.9930555555555555 | 0 |
| 0.99375 | 0 |
| 0.9944444444444445 | 0 |
| 0.9951388888888889 | 0 |
| 0.9958333333333332 | 0 |
| 0.9965277777777778 | 0 |
| 0.9972222222222222 | 0 |
| 0.9979166666666667 | 0 |
| 0.998611111111111 | 0 |
| 0.9993055555555556 | 0 |